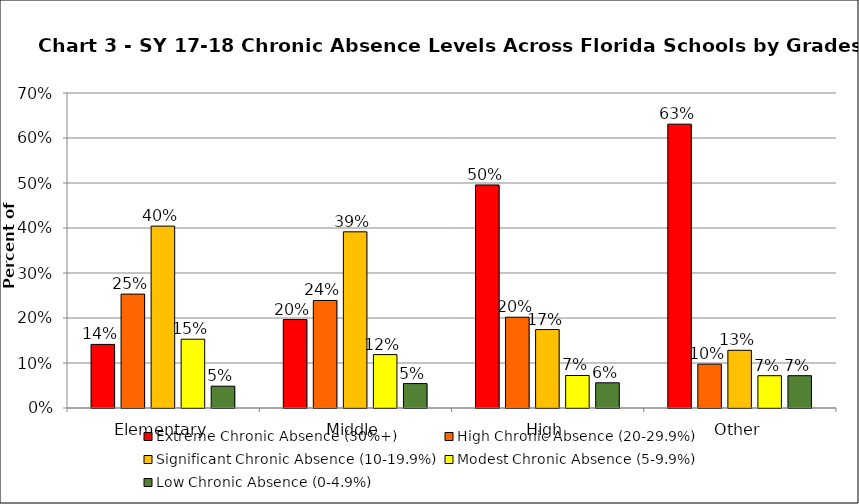
| Category | Extreme Chronic Absence (30%+) | High Chronic Absence (20-29.9%) | Significant Chronic Absence (10-19.9%) | Modest Chronic Absence (5-9.9%) | Low Chronic Absence (0-4.9%) |
|---|---|---|---|---|---|
| 0 | 0.141 | 0.253 | 0.404 | 0.153 | 0.048 |
| 1 | 0.197 | 0.239 | 0.392 | 0.119 | 0.054 |
| 2 | 0.496 | 0.202 | 0.174 | 0.072 | 0.056 |
| 3 | 0.631 | 0.097 | 0.128 | 0.072 | 0.072 |